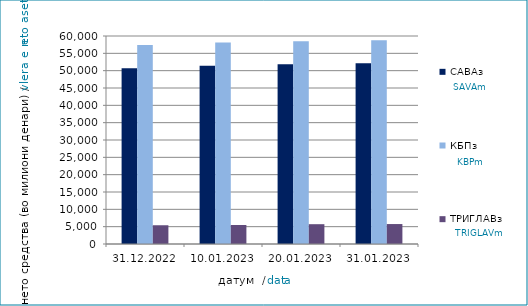
| Category | САВАз | КБПз | ТРИГЛАВз |
|---|---|---|---|
| 2022-12-31 | 50715.461 | 57418.836 | 5407.762 |
| 2023-01-10 | 51431.186 | 58117.594 | 5475.502 |
| 2023-01-20 | 51842.098 | 58510.032 | 5714.802 |
| 2023-01-31 | 52156.216 | 58793.2 | 5756.637 |